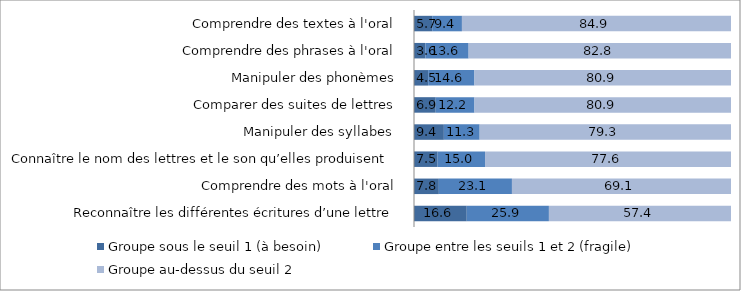
| Category | Groupe sous le seuil 1 (à besoin) | Groupe entre les seuils 1 et 2 (fragile) | Groupe au-dessus du seuil 2 |
|---|---|---|---|
| Reconnaître les différentes écritures d’une lettre | 16.64 | 25.92 | 57.44 |
| Comprendre des mots à l'oral | 7.84 | 23.06 | 69.11 |
| Connaître le nom des lettres et le son qu’elles produisent  | 7.45 | 14.96 | 77.58 |
| Manipuler des syllabes  | 9.42 | 11.29 | 79.28 |
| Comparer des suites de lettres | 6.85 | 12.23 | 80.92 |
| Manipuler des phonèmes | 4.48 | 14.59 | 80.93 |
| Comprendre des phrases à l'oral | 3.6 | 13.63 | 82.77 |
| Comprendre des textes à l'oral | 5.74 | 9.38 | 84.88 |